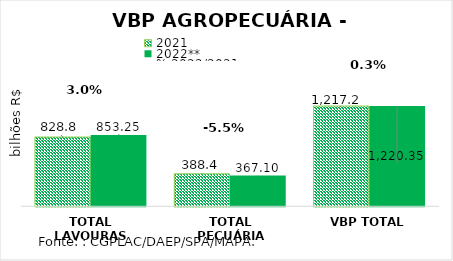
| Category | 2021 | 2022** |
|---|---|---|
| TOTAL LAVOURAS | 828.776 | 853.252 |
| TOTAL PECUÁRIA | 388.417 | 367.102 |
| VBP TOTAL | 1217.194 | 1220.354 |